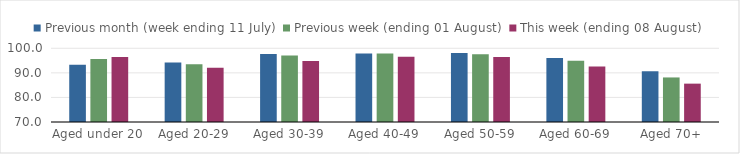
| Category | Previous month (week ending 11 July) | Previous week (ending 01 August) | This week (ending 08 August) |
|---|---|---|---|
| Aged under 20 | 93.328 | 95.671 | 96.408 |
| Aged 20-29 | 94.176 | 93.465 | 92.044 |
| Aged 30-39 | 97.678 | 97.033 | 94.803 |
| Aged 40-49 | 97.915 | 97.842 | 96.534 |
| Aged 50-59 | 98.073 | 97.576 | 96.5 |
| Aged 60-69 | 96.06 | 94.964 | 92.537 |
| Aged 70+ | 90.653 | 88.131 | 85.611 |